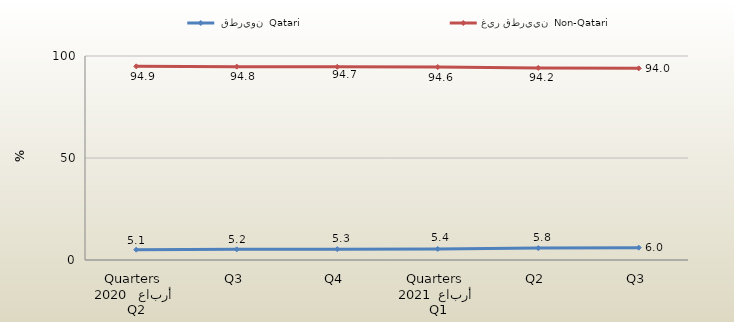
| Category |  قطريون  Qatari | غير قطريين  Non-Qatari |
|---|---|---|
| 0 | 5.067 | 94.933 |
| 1 | 5.214 | 94.786 |
| 2 | 5.293 | 94.707 |
| 3 | 5.404 | 94.596 |
| 4 | 5.836 | 94.164 |
| 5 | 6.047 | 93.953 |